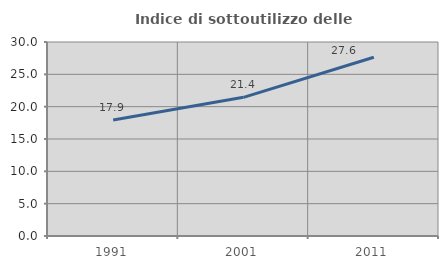
| Category | Indice di sottoutilizzo delle abitazioni  |
|---|---|
| 1991.0 | 17.931 |
| 2001.0 | 21.445 |
| 2011.0 | 27.641 |